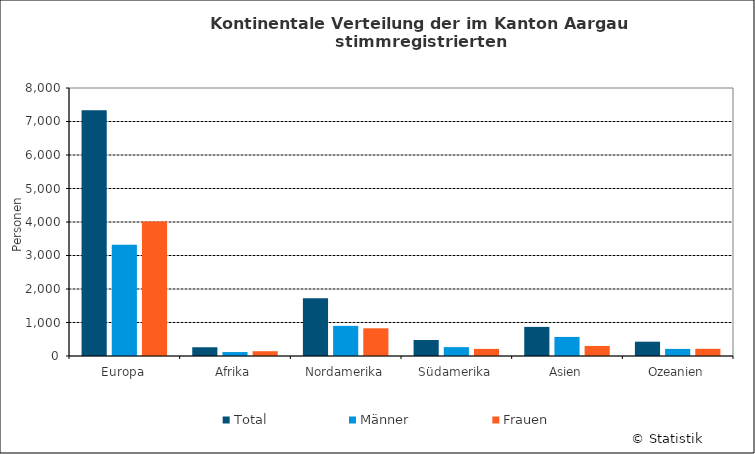
| Category | Total | Männer | Frauen |
|---|---|---|---|
| Europa | 7338 | 3324 | 4014 |
| Afrika | 261 | 118 | 143 |
| Nordamerika | 1726 | 899 | 827 |
| Südamerika | 477 | 265 | 212 |
| Asien | 869 | 569 | 300 |
| Ozeanien | 427 | 212 | 215 |